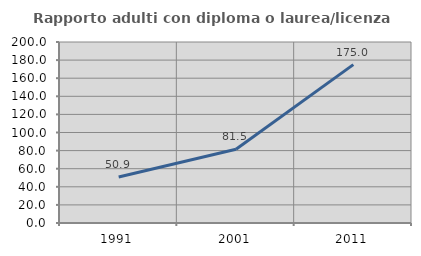
| Category | Rapporto adulti con diploma o laurea/licenza media  |
|---|---|
| 1991.0 | 50.923 |
| 2001.0 | 81.461 |
| 2011.0 | 175 |